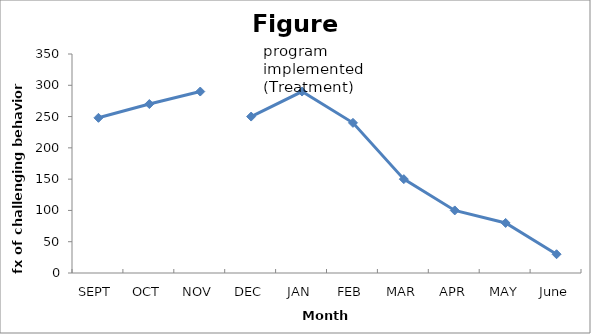
| Category | Series 0 |
|---|---|
| SEPT | 248 |
| OCT | 270 |
| NOV | 290 |
| DEC | 250 |
| JAN | 290 |
| FEB | 240 |
| MAR | 150 |
| APR | 100 |
| MAY | 80 |
| June | 30 |